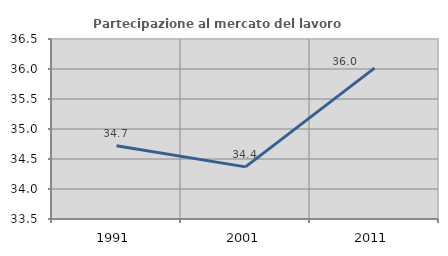
| Category | Partecipazione al mercato del lavoro  femminile |
|---|---|
| 1991.0 | 34.72 |
| 2001.0 | 34.369 |
| 2011.0 | 36.015 |